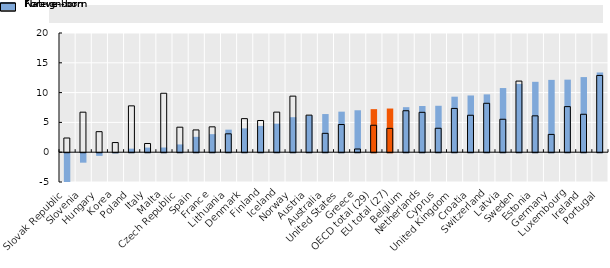
| Category | Foreign-born | Native-born |
|---|---|---|
| Slovak Republic | -6.95 | 2.382 |
| Slovenia | -1.589 | 6.715 |
| Hungary | -0.447 | 3.446 |
| Korea | -0.04 | 1.618 |
| Poland | 0.594 | 7.775 |
| Italy | 0.773 | 1.461 |
| Malta | 0.788 | 9.888 |
| Czech Republic | 1.305 | 4.195 |
| Spain | 2.577 | 3.736 |
| France | 3.028 | 4.256 |
| Lithuania | 3.784 | 3.085 |
| Denmark | 4.003 | 5.632 |
| Finland | 4.41 | 5.317 |
| Iceland | 4.778 | 6.726 |
| Norway | 5.874 | 9.407 |
| Austria | 6.153 | 6.22 |
| Australia | 6.401 | 3.166 |
| United States | 6.803 | 4.643 |
| Greece | 7.035 | 0.535 |
| OECD total (29) | 7.223 | 4.522 |
| EU total (27) | 7.326 | 3.998 |
| Belgium | 7.555 | 6.956 |
| Netherlands | 7.749 | 6.692 |
| Cyprus | 7.79 | 4.016 |
| United Kingdom | 9.315 | 7.343 |
| Croatia | 9.517 | 6.197 |
| Switzerland | 9.701 | 8.205 |
| Latvia | 10.765 | 5.527 |
| Sweden | 11.45 | 11.931 |
| Estonia | 11.811 | 6.103 |
| Germany | 12.133 | 2.985 |
| Luxembourg | 12.172 | 7.649 |
| Ireland | 12.604 | 6.363 |
| Portugal | 13.378 | 12.877 |